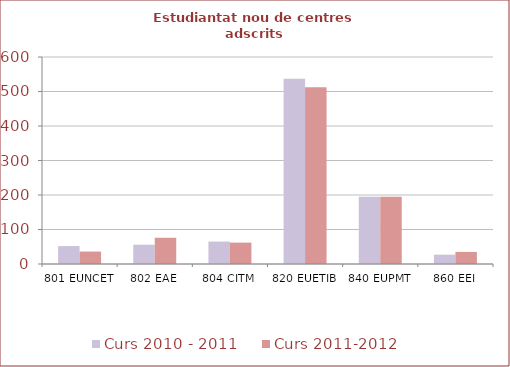
| Category | Curs 2010 - 2011 | Curs 2011-2012 |
|---|---|---|
| 801 EUNCET | 52 | 36 |
| 802 EAE | 56 | 76 |
| 804 CITM | 65 | 62 |
| 820 EUETIB | 537 | 512 |
| 840 EUPMT | 195 | 195 |
| 860 EEI | 27 | 35 |